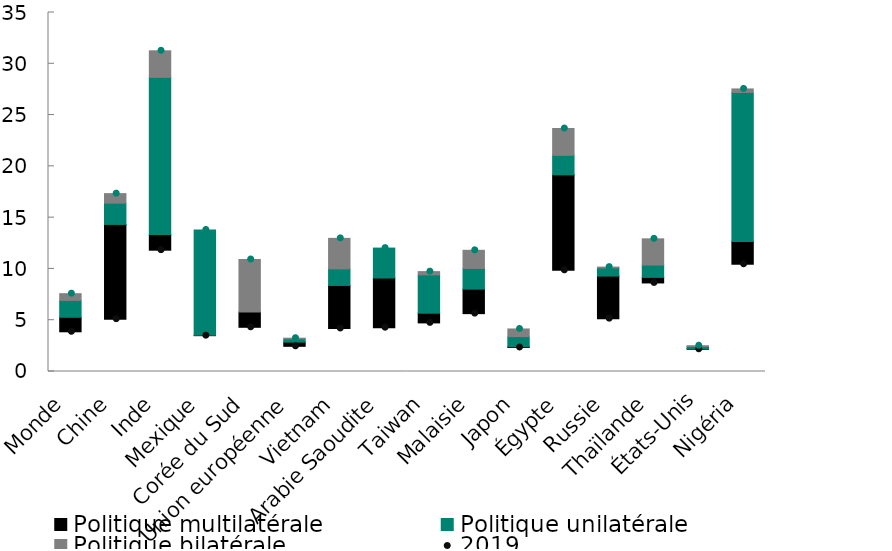
| Category | 2019 | Politique multilatérale | Politique unilatérale  | Politique bilatérale |
|---|---|---|---|---|
| Monde | 3.871 | 1.414 | 1.646 | 0.656 |
| Chine | 5.102 | 9.237 | 2.076 | 0.928 |
| Inde | 11.826 | 1.537 | 15.312 | 2.59 |
| Mexique | 3.492 | 0.037 | 10.269 | 0 |
| Corée du Sud | 4.31 | 1.493 | 0 | 5.118 |
| Union européenne | 2.455 | 0.405 | 0.324 | 0.064 |
| Vietnam | 4.195 | 4.193 | 1.624 | 2.968 |
| Arabie Saoudite | 4.271 | 4.841 | 2.919 | 0 |
| Taiwan | 4.737 | 0.947 | 3.739 | 0.314 |
| Malaisie  | 5.641 | 2.39 | 2.015 | 1.768 |
| Japon | 2.341 | 0.072 | 0.989 | 0.745 |
| Égypte | 9.866 | 9.308 | 1.898 | 2.617 |
| Russie | 5.152 | 4.151 | 0.793 | 0.083 |
| Thaïlande | 8.633 | 0.541 | 1.205 | 2.555 |
| États-Unis | 2.167 | 0.074 | 0.202 | 0.069 |
| Nigéria | 10.456 | 2.219 | 14.529 | 0.346 |